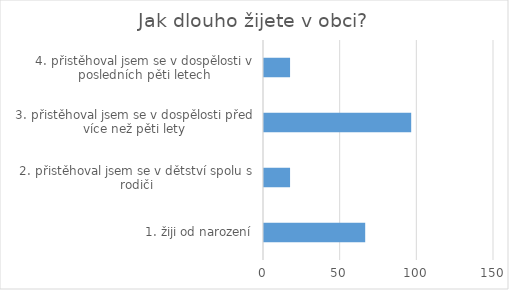
| Category | Series 0 |
|---|---|
| 1. žiji od narození | 66 |
| 2. přistěhoval jsem se v dětství spolu s rodiči | 17 |
| 3. přistěhoval jsem se v dospělosti před více než pěti lety | 96 |
| 4. přistěhoval jsem se v dospělosti v posledních pěti letech | 17 |